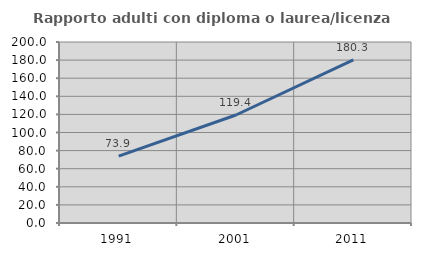
| Category | Rapporto adulti con diploma o laurea/licenza media  |
|---|---|
| 1991.0 | 73.885 |
| 2001.0 | 119.355 |
| 2011.0 | 180.347 |